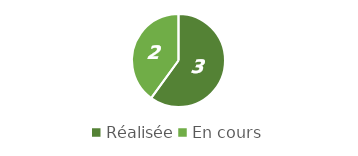
| Category | Series 0 |
|---|---|
| Réalisée | 3 |
| En cours | 2 |